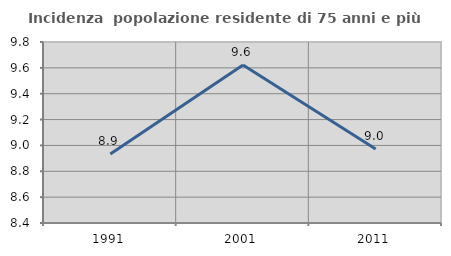
| Category | Incidenza  popolazione residente di 75 anni e più |
|---|---|
| 1991.0 | 8.933 |
| 2001.0 | 9.622 |
| 2011.0 | 8.973 |